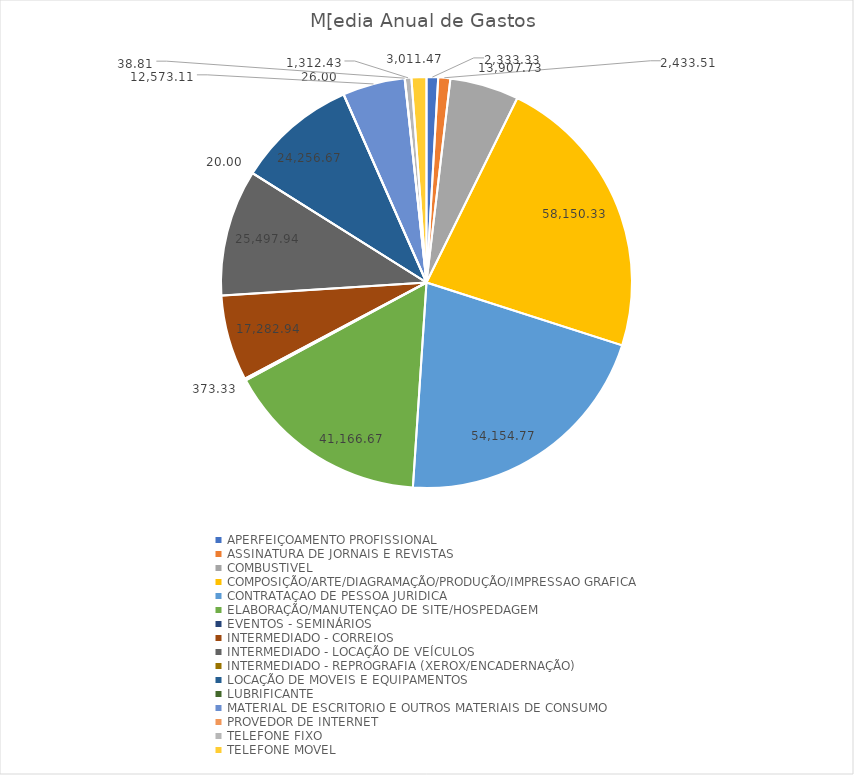
| Category | Series 0 |
|---|---|
| APERFEIÇOAMENTO PROFISSIONAL | 2333.333 |
| ASSINATURA DE JORNAIS E REVISTAS | 2433.507 |
| COMBUSTIVEL | 13907.73 |
| COMPOSIÇÃO/ARTE/DIAGRAMAÇÃO/PRODUÇÃO/IMPRESSAO GRAFICA | 58150.333 |
| CONTRATAÇAO DE PESSOA JURIDICA | 54154.77 |
| ELABORAÇÃO/MANUTENÇAO DE SITE/HOSPEDAGEM | 41166.667 |
| EVENTOS - SEMINÁRIOS | 373.333 |
| INTERMEDIADO - CORREIOS | 17282.94 |
| INTERMEDIADO - LOCAÇÃO DE VEÍCULOS | 25497.94 |
| INTERMEDIADO - REPROGRAFIA (XEROX/ENCADERNAÇÃO) | 20 |
| LOCAÇÃO DE MOVEIS E EQUIPAMENTOS | 24256.667 |
| LUBRIFICANTE | 26 |
| MATERIAL DE ESCRITORIO E OUTROS MATERIAIS DE CONSUMO | 12573.107 |
| PROVEDOR DE INTERNET | 38.81 |
| TELEFONE FIXO | 1312.427 |
| TELEFONE MOVEL | 3011.47 |